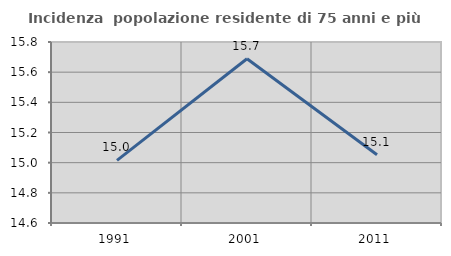
| Category | Incidenza  popolazione residente di 75 anni e più |
|---|---|
| 1991.0 | 15.015 |
| 2001.0 | 15.689 |
| 2011.0 | 15.052 |